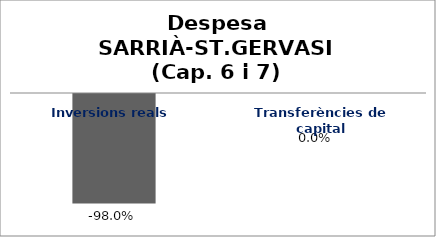
| Category | Series 0 |
|---|---|
| Inversions reals | -0.98 |
| Transferències de capital | 0 |